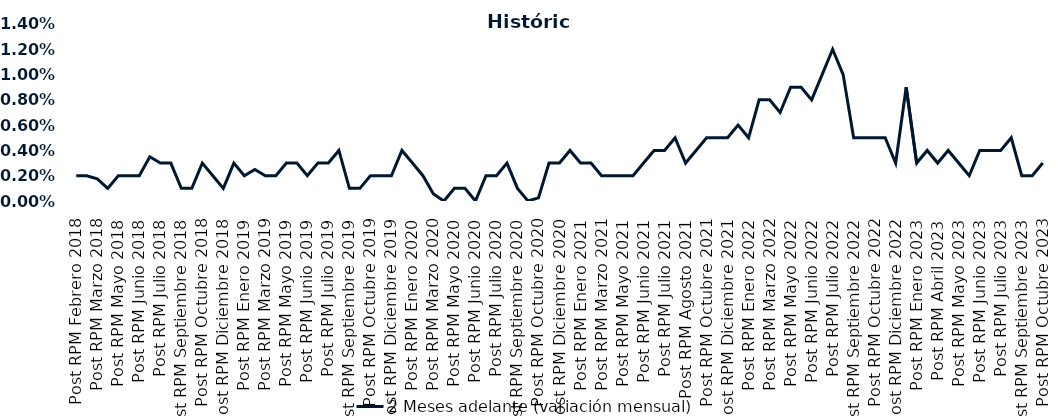
| Category | 2 Meses adelante (variación mensual) |
|---|---|
| Post RPM Febrero 2018 | 0.002 |
| Pre RPM Marzo 2018 | 0.002 |
| Post RPM Marzo 2018 | 0.002 |
| Pre RPM Mayo 2018 | 0.001 |
| Post RPM Mayo 2018 | 0.002 |
| Pre RPM Junio 2018 | 0.002 |
| Post RPM Junio 2018 | 0.002 |
| Pre RPM Julio 2018 | 0.004 |
| Post RPM Julio 2018 | 0.003 |
| Pre RPM Septiembre 2018 | 0.003 |
| Post RPM Septiembre 2018 | 0.001 |
| Pre RPM Octubre 2018 | 0.001 |
| Post RPM Octubre 2018 | 0.003 |
| Pre RPM Diciembre 2018 | 0.002 |
| Post RPM Diciembre 2018 | 0.001 |
| Pre RPM Enero 2019 | 0.003 |
| Post RPM Enero 2019 | 0.002 |
| Pre RPM Marzo 2019 | 0.002 |
| Post RPM Marzo 2019 | 0.002 |
| Pre RPM Mayo 2019 | 0.002 |
| Post RPM Mayo 2019 | 0.003 |
| Pre RPM Junio 2019 | 0.003 |
| Post RPM Junio 2019 | 0.002 |
| Pre RPM Julio 2019 | 0.003 |
| Post RPM Julio 2019 | 0.003 |
| Pre RPM Septiembre 2019 | 0.004 |
| Post RPM Septiembre 2019 | 0.001 |
| Pre RPM Octubre 2019 | 0.001 |
| Post RPM Octubre 2019 | 0.002 |
| Pre RPM Diciembre 2019 | 0.002 |
| Post RPM Diciembre 2019 | 0.002 |
| Pre RPM Enero 2020 | 0.004 |
| Post RPM Enero 2020 | 0.003 |
| Pre RPM Marzo 2020 | 0.002 |
| Post RPM Marzo 2020 | 0.001 |
| Pre RPM Mayo 2020 | 0 |
| Post RPM Mayo 2020 | 0.001 |
| Pre RPM Junio 2020 | 0.001 |
| Post RPM Junio 2020 | 0 |
| Pre RPM Julio 2020 | 0.002 |
| Post RPM Julio 2020 | 0.002 |
| Pre RPM Septiembre 2020 | 0.003 |
| Post RPM Septiembre 2020 | 0.001 |
| Pre RPM Octubre 2020 | 0 |
| Post RPM Octubre 2020 | 0 |
| Pre RPM Diciembre 2020 | 0.003 |
| Post RPM Diciembre 2020 | 0.003 |
| Pre RPM Enero 2021 | 0.004 |
| Post RPM Enero 2021 | 0.003 |
| Pre RPM Marzo 2021 | 0.003 |
| Post RPM Marzo 2021 | 0.002 |
| Pre RPM Mayo 2021 | 0.002 |
| Post RPM Mayo 2021 | 0.002 |
| Pre RPM Junio 2021 | 0.002 |
| Post RPM Junio 2021 | 0.003 |
| Pre RPM Julio 2021 | 0.004 |
| Post RPM Julio 2021 | 0.004 |
| Pre RPM Agosto 2021 | 0.005 |
| Post RPM Agosto 2021 | 0.003 |
| Pre RPM Octubre 2021 | 0.004 |
| Post RPM Octubre 2021 | 0.005 |
| Pre RPM Diciembre 2021 | 0.005 |
| Post RPM Diciembre 2021 | 0.005 |
| Pre RPM Enero 2022 | 0.006 |
| Post RPM Enero 2022 | 0.005 |
| Pre RPM Marzo 2022 | 0.008 |
| Post RPM Marzo 2022 | 0.008 |
| Pre RPM Mayo 2022 | 0.007 |
| Post RPM Mayo 2022 | 0.009 |
| Pre RPM Junio 2022 | 0.009 |
| Post RPM Junio 2022 | 0.008 |
| Pre RPM Julio 2022 | 0.01 |
| Post RPM Julio 2022 | 0.012 |
| Pre RPM Septiembre 2022 | 0.01 |
| Post RPM Septiembre 2022 | 0.005 |
| Pre RPM Octubre 2022 | 0.005 |
| Post RPM Octubre 2022 | 0.005 |
| Pre RPM Diciembre 2022 | 0.005 |
| Post RPM Diciembre 2022 | 0.003 |
| Pre RPM Enero 2023 | 0.009 |
| Post RPM Enero 2023 | 0.003 |
| Pre RPM Abril 2023 | 0.004 |
| Post RPM Abril 2023 | 0.003 |
| Pre RPM Mayo 2023 | 0.004 |
| Post RPM Mayo 2023 | 0.003 |
| Pre RPM Junio 2023 | 0.002 |
| Post RPM Junio 2023 | 0.004 |
| Pre RPM Julio 2023 | 0.004 |
| Post RPM Julio 2023 | 0.004 |
| Pre RPM Septiembre 2023 | 0.005 |
| Post RPM Septiembre 2023 | 0.002 |
| Pre RPM Octubre 2023 | 0.002 |
| Post RPM Octubre 2023 | 0.003 |